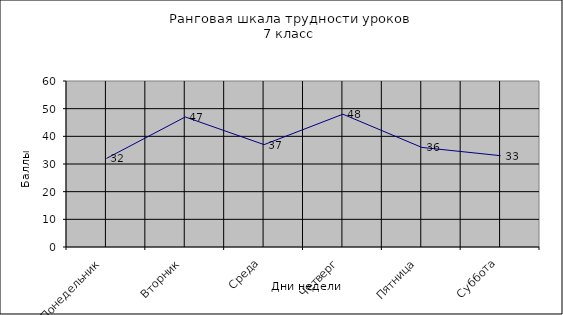
| Category | Series 0 |
|---|---|
| Понедельник | 32 |
| Вторник | 47 |
| Среда | 37 |
| Четверг | 48 |
| Пятница | 36 |
| Суббота | 33 |